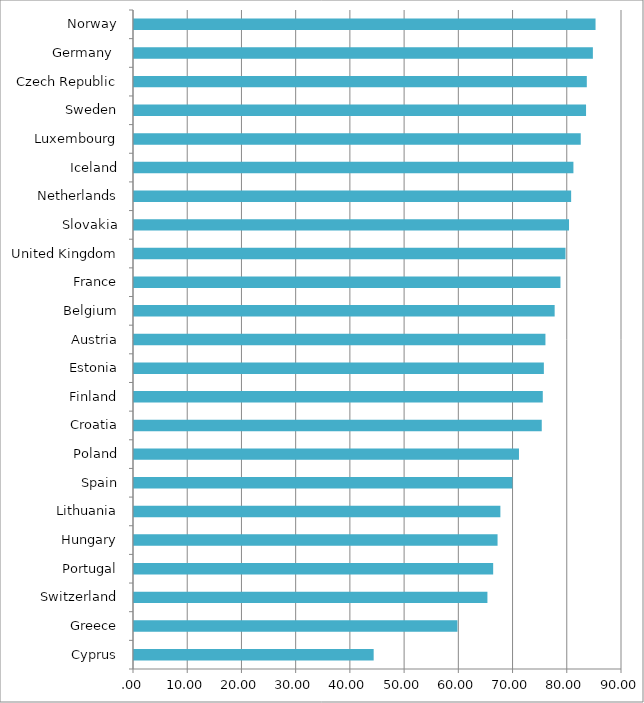
| Category | Series 0 |
|---|---|
| Cyprus | 44.2 |
| Greece | 59.65 |
| Switzerland | 65.18 |
| Portugal | 66.24 |
| Hungary | 67.05 |
| Lithuania | 67.57 |
| Spain | 69.79 |
| Poland | 71 |
| Croatia | 75.2 |
| Finland | 75.39 |
| Estonia | 75.59 |
| Austria | 75.88 |
| Belgium | 77.58 |
| France | 78.65 |
| United Kingdom | 79.58 |
| Slovakia | 80.23 |
| Netherlands | 80.62 |
| Iceland | 81.04 |
| Luxembourg | 82.39 |
| Sweden | 83.37 |
| Czech Republic | 83.51 |
| Germany  | 84.63 |
| Norway | 85.12 |